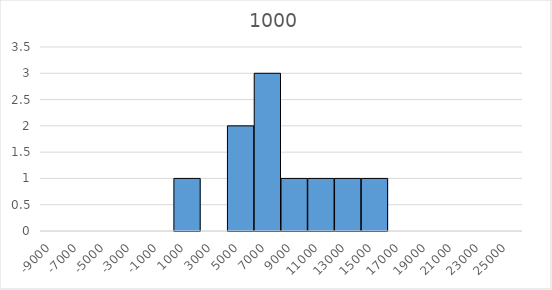
| Category | Series 0 | Series 1 |
|---|---|---|
| -9000.0 | 0 | 0 |
| -7000.0 | 0 | 0 |
| -5000.0 | 0 | 0 |
| -3000.0 | 0 | 0 |
| -1000.0 | 0 | 0 |
| 1000.0 | 0 | 1 |
| 3000.0 | 0 | 0 |
| 5000.0 | 0 | 2 |
| 7000.0 | 0 | 3 |
| 9000.0 | 0 | 1 |
| 11000.0 | 0 | 1 |
| 13000.0 | 0 | 1 |
| 15000.0 | 0 | 1 |
| 17000.0 | 0 | 0 |
| 19000.0 | 0 | 0 |
| 21000.0 | 0 | 0 |
| 23000.0 | 0 | 0 |
| 25000.0 | 0 | 0 |